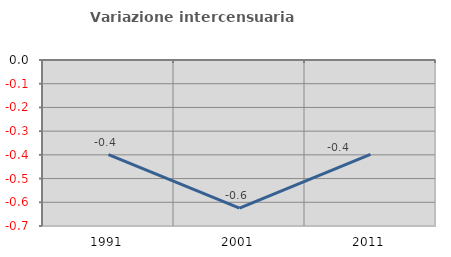
| Category | Variazione intercensuaria annua |
|---|---|
| 1991.0 | -0.399 |
| 2001.0 | -0.624 |
| 2011.0 | -0.398 |